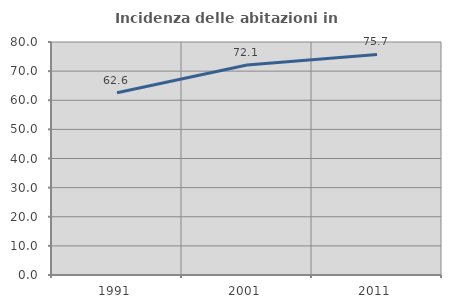
| Category | Incidenza delle abitazioni in proprietà  |
|---|---|
| 1991.0 | 62.568 |
| 2001.0 | 72.099 |
| 2011.0 | 75.711 |